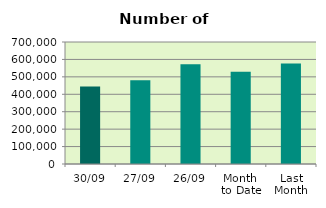
| Category | Series 0 |
|---|---|
| 30/09 | 444656 |
| 27/09 | 480398 |
| 26/09 | 571814 |
| Month 
to Date | 529677.905 |
| Last
Month | 576518.909 |